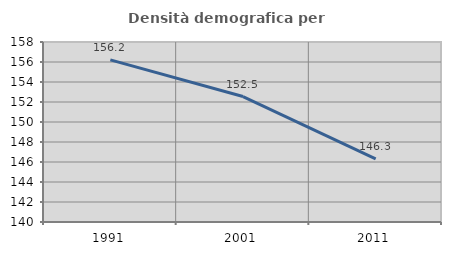
| Category | Densità demografica |
|---|---|
| 1991.0 | 156.215 |
| 2001.0 | 152.546 |
| 2011.0 | 146.322 |